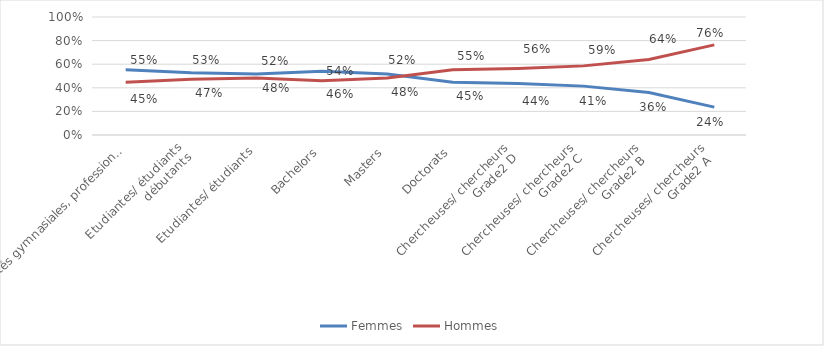
| Category | Femmes | Hommes |
|---|---|---|
| Maturités gymnasiales, professionnelles et spécialisées | 0.553 | 0.447 |
| Etudiantes/ étudiants
débutants | 0.528 | 0.472 |
| Etudiantes/ étudiants | 0.517 | 0.483 |
| Bachelors | 0.541 | 0.459 |
| Masters | 0.517 | 0.483 |
| Doctorats | 0.448 | 0.552 |
| Chercheuses/ chercheurs
Grade2 D | 0.437 | 0.563 |
| Chercheuses/ chercheurs
Grade2 C | 0.414 | 0.586 |
| Chercheuses/ chercheurs
Grade2 B  | 0.36 | 0.64 |
| Chercheuses/ chercheurs
Grade2 A  | 0.236 | 0.764 |